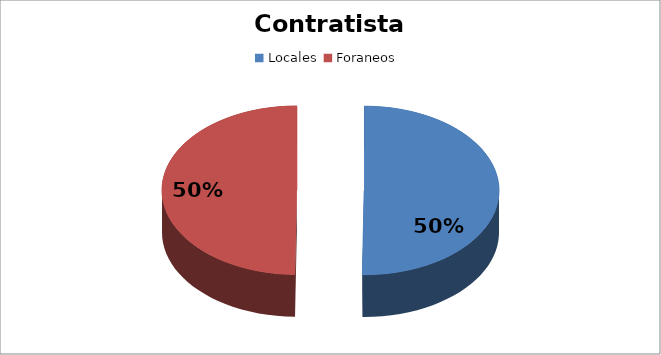
| Category | Suma |
|---|---|
| Locales  | 20077913.13 |
| Foraneos  | 19909178.78 |